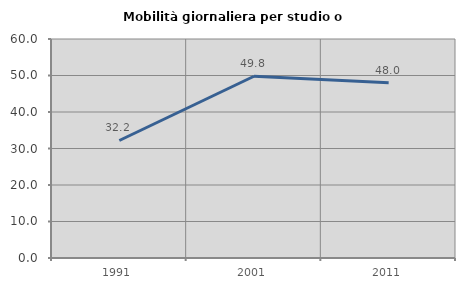
| Category | Mobilità giornaliera per studio o lavoro |
|---|---|
| 1991.0 | 32.194 |
| 2001.0 | 49.796 |
| 2011.0 | 48.023 |